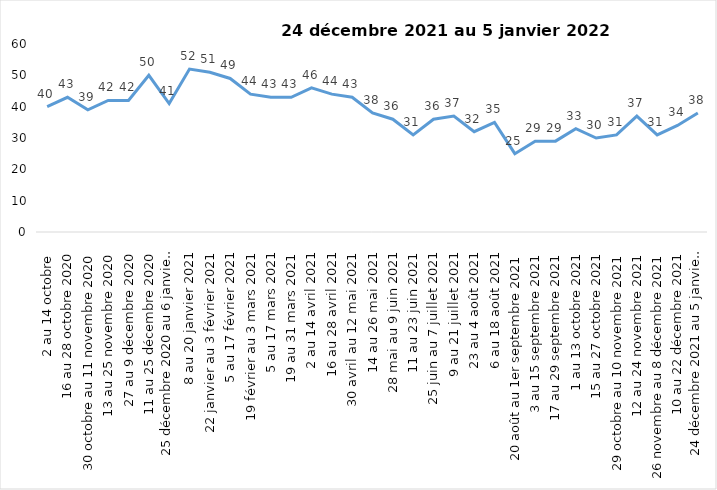
| Category | Toujours aux trois mesures |
|---|---|
| 2 au 14 octobre  | 40 |
| 16 au 28 octobre 2020 | 43 |
| 30 octobre au 11 novembre 2020 | 39 |
| 13 au 25 novembre 2020 | 42 |
| 27 au 9 décembre 2020 | 42 |
| 11 au 25 décembre 2020 | 50 |
| 25 décembre 2020 au 6 janvier 2021 | 41 |
| 8 au 20 janvier 2021 | 52 |
| 22 janvier au 3 février 2021 | 51 |
| 5 au 17 février 2021 | 49 |
| 19 février au 3 mars 2021 | 44 |
| 5 au 17 mars 2021 | 43 |
| 19 au 31 mars 2021 | 43 |
| 2 au 14 avril 2021 | 46 |
| 16 au 28 avril 2021 | 44 |
| 30 avril au 12 mai 2021 | 43 |
| 14 au 26 mai 2021 | 38 |
| 28 mai au 9 juin 2021 | 36 |
| 11 au 23 juin 2021 | 31 |
| 25 juin au 7 juillet 2021 | 36 |
| 9 au 21 juillet 2021 | 37 |
| 23 au 4 août 2021 | 32 |
| 6 au 18 août 2021 | 35 |
| 20 août au 1er septembre 2021 | 25 |
| 3 au 15 septembre 2021 | 29 |
| 17 au 29 septembre 2021 | 29 |
| 1 au 13 octobre 2021 | 33 |
| 15 au 27 octobre 2021 | 30 |
| 29 octobre au 10 novembre 2021 | 31 |
| 12 au 24 novembre 2021 | 37 |
| 26 novembre au 8 décembre 2021 | 31 |
| 10 au 22 décembre 2021 | 34 |
| 24 décembre 2021 au 5 janvier 2022 2022 | 38 |